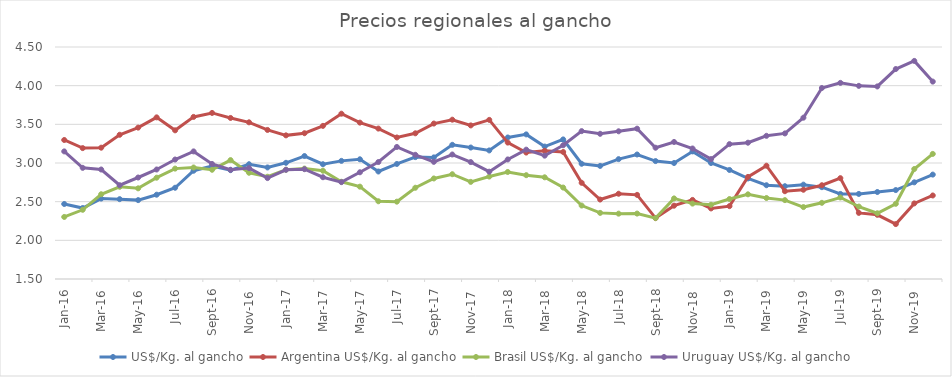
| Category | US$/Kg. al gancho | Argentina US$/Kg. al gancho | Brasil US$/Kg. al gancho | Uruguay US$/Kg. al gancho |
|---|---|---|---|---|
| 2016-01-01 | 2.47 | 3.298 | 2.302 | 3.15 |
| 2016-02-01 | 2.418 | 3.192 | 2.395 | 2.938 |
| 2016-03-01 | 2.54 | 3.198 | 2.596 | 2.916 |
| 2016-04-01 | 2.532 | 3.365 | 2.692 | 2.713 |
| 2016-05-01 | 2.52 | 3.458 | 2.673 | 2.812 |
| 2016-06-01 | 2.59 | 3.59 | 2.81 | 2.916 |
| 2016-07-01 | 2.68 | 3.422 | 2.927 | 3.045 |
| 2016-08-01 | 2.9 | 3.596 | 2.942 | 3.15 |
| 2016-09-01 | 2.96 | 3.648 | 2.912 | 2.988 |
| 2016-10-01 | 2.907 | 3.582 | 3.037 | 2.912 |
| 2016-11-01 | 2.984 | 3.526 | 2.874 | 2.934 |
| 2016-12-01 | 2.942 | 3.428 | 2.822 | 2.805 |
| 2017-01-01 | 3.002 | 3.358 | 2.912 | 2.912 |
| 2017-02-01 | 3.09 | 3.385 | 2.927 | 2.92 |
| 2017-03-01 | 2.984 | 3.48 | 2.9 | 2.816 |
| 2017-04-01 | 3.028 | 3.638 | 2.758 | 2.753 |
| 2017-05-01 | 3.048 | 3.522 | 2.694 | 2.88 |
| 2017-06-01 | 2.89 | 3.445 | 2.505 | 3.012 |
| 2017-07-01 | 2.988 | 3.33 | 2.5 | 3.208 |
| 2017-08-01 | 3.076 | 3.384 | 2.68 | 3.106 |
| 2017-09-01 | 3.073 | 3.51 | 2.8 | 3.015 |
| 2017-10-01 | 3.235 | 3.56 | 2.855 | 3.11 |
| 2017-11-01 | 3.2 | 3.486 | 2.756 | 3.012 |
| 2017-12-01 | 3.162 | 3.558 | 2.825 | 2.887 |
| 2018-01-01 | 3.33 | 3.264 | 2.884 | 3.046 |
| 2018-02-01 | 3.37 | 3.135 | 2.843 | 3.173 |
| 2018-03-01 | 3.213 | 3.158 | 2.815 | 3.095 |
| 2018-04-01 | 3.305 | 3.142 | 2.682 | 3.23 |
| 2018-05-01 | 2.99 | 2.744 | 2.45 | 3.412 |
| 2018-06-01 | 2.963 | 2.528 | 2.355 | 3.378 |
| 2018-07-01 | 3.05 | 2.602 | 2.345 | 3.41 |
| 2018-08-01 | 3.11 | 2.588 | 2.346 | 3.444 |
| 2018-09-01 | 3.025 | 2.288 | 2.288 | 3.198 |
| 2018-10-01 | 3 | 2.448 | 2.542 | 3.272 |
| 2018-11-01 | 3.15 | 2.522 | 2.475 | 3.188 |
| 2018-12-01 | 3 | 2.412 | 2.46 | 3.05 |
| 2019-01-01 | 2.91 | 2.442 | 2.534 | 3.244 |
| 2019-02-01 | 2.8 | 2.82 | 2.595 | 3.262 |
| 2019-03-01 | 2.713 | 2.965 | 2.548 | 3.352 |
| 2019-04-01 | 2.7 | 2.635 | 2.52 | 3.382 |
| 2019-05-01 | 2.72 | 2.654 | 2.43 | 3.586 |
| 2019-06-01 | 2.688 | 2.713 | 2.485 | 3.97 |
| 2019-07-01 | 2.6 | 2.804 | 2.554 | 4.036 |
| 2019-08-01 | 2.6 | 2.355 | 2.437 | 3.998 |
| 2019-09-01 | 2.625 | 2.33 | 2.35 | 3.99 |
| 2019-10-01 | 2.65 | 2.21 | 2.472 | 4.215 |
| 2019-11-01 | 2.75 | 2.478 | 2.922 | 4.32 |
| 2019-12-01 | 2.85 | 2.58 | 3.118 | 4.052 |